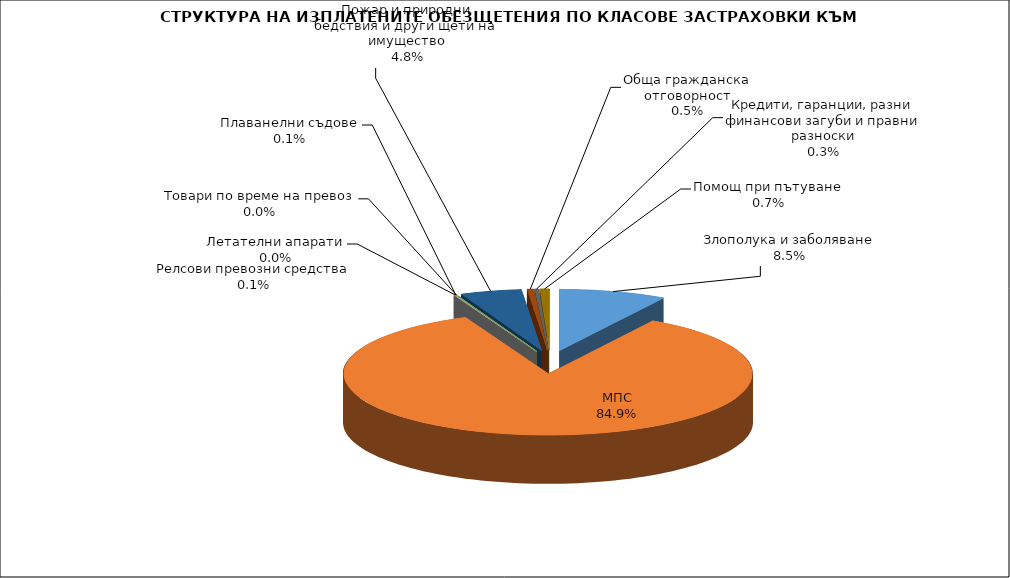
| Category | Злополука и заболяване |
|---|---|
| Злополука и заболяване | 0.085 |
| МПС | 0.849 |
| Релсови превозни средства | 0.001 |
| Летателни апарати | 0 |
| Плаванелни съдове | 0.001 |
| Товари по време на превоз | 0 |
| Пожар и природни бедствия и други щети на имущество | 0.048 |
| Обща гражданска отговорност | 0.005 |
| Кредити, гаранции, разни финансови загуби и правни разноски | 0.003 |
| Помощ при пътуване | 0.007 |